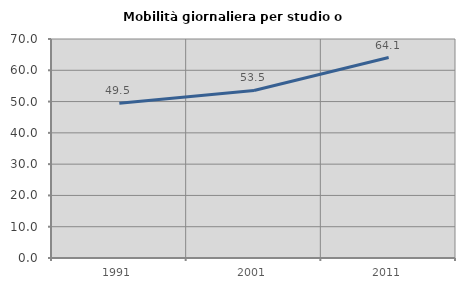
| Category | Mobilità giornaliera per studio o lavoro |
|---|---|
| 1991.0 | 49.453 |
| 2001.0 | 53.54 |
| 2011.0 | 64.085 |